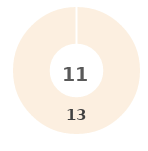
| Category | Series 0 |
|---|---|
| 0 | 0 |
| 1 | 0 |
| 2 | 0 |
| 3 | 0 |
| 4 | 13 |